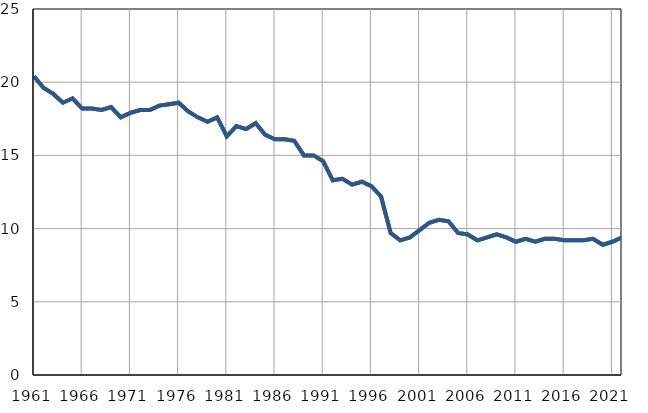
| Category |  РЕПУБЛИКА СРБИЈА |  Република Србија |
|---|---|---|
| 1961.0 | 20.4 | 20.4 |
| 1962.0 | 19.6 | 19.6 |
| 1963.0 | 19.2 | 19.2 |
| 1964.0 | 18.6 | 18.6 |
| 1965.0 | 18.9 | 18.9 |
| 1966.0 | 18.2 | 18.2 |
| 1967.0 | 18.2 | 18.2 |
| 1968.0 | 18.1 | 18.1 |
| 1969.0 | 18.3 | 18.3 |
| 1970.0 | 17.6 | 17.6 |
| 1971.0 | 17.9 | 17.9 |
| 1972.0 | 18.1 | 18.1 |
| 1973.0 | 18.1 | 18.1 |
| 1974.0 | 18.4 | 18.4 |
| 1975.0 | 18.5 | 18.5 |
| 1976.0 | 18.6 | 18.6 |
| 1977.0 | 18 | 18 |
| 1978.0 | 17.6 | 17.6 |
| 1979.0 | 17.3 | 17.3 |
| 1980.0 | 17.6 | 17.6 |
| 1981.0 | 16.3 | 16.3 |
| 1982.0 | 17 | 17 |
| 1983.0 | 16.8 | 16.8 |
| 1984.0 | 17.2 | 17.2 |
| 1985.0 | 16.4 | 16.4 |
| 1986.0 | 16.1 | 16.1 |
| 1987.0 | 16.1 | 16.1 |
| 1988.0 | 16 | 16 |
| 1989.0 | 15 | 15 |
| 1990.0 | 15 | 15 |
| 1991.0 | 14.6 | 14.6 |
| 1992.0 | 13.3 | 13.3 |
| 1993.0 | 13.4 | 13.4 |
| 1994.0 | 13 | 13 |
| 1995.0 | 13.2 | 13.2 |
| 1996.0 | 12.9 | 12.9 |
| 1997.0 | 12.2 | 12.2 |
| 1998.0 | 9.7 | 9.7 |
| 1999.0 | 9.2 | 9.2 |
| 2000.0 | 9.4 | 9.4 |
| 2001.0 | 9.9 | 9.9 |
| 2002.0 | 10.4 | 10.4 |
| 2003.0 | 10.6 | 10.6 |
| 2004.0 | 10.5 | 10.5 |
| 2005.0 | 9.7 | 9.7 |
| 2006.0 | 9.6 | 9.6 |
| 2007.0 | 9.2 | 9.2 |
| 2008.0 | 9.4 | 9.4 |
| 2009.0 | 9.6 | 9.6 |
| 2010.0 | 9.4 | 9.4 |
| 2011.0 | 9.1 | 9.1 |
| 2012.0 | 9.3 | 9.3 |
| 2013.0 | 9.1 | 9.1 |
| 2014.0 | 9.3 | 9.3 |
| 2015.0 | 9.3 | 9.3 |
| 2016.0 | 9.2 | 9.2 |
| 2017.0 | 9.2 | 9.2 |
| 2018.0 | 9.2 | 9.2 |
| 2019.0 | 9.3 | 9.3 |
| 2020.0 | 8.9 | 8.9 |
| 2021.0 | 9.1 | 9.1 |
| 2022.0 | 9.4 | 9.4 |